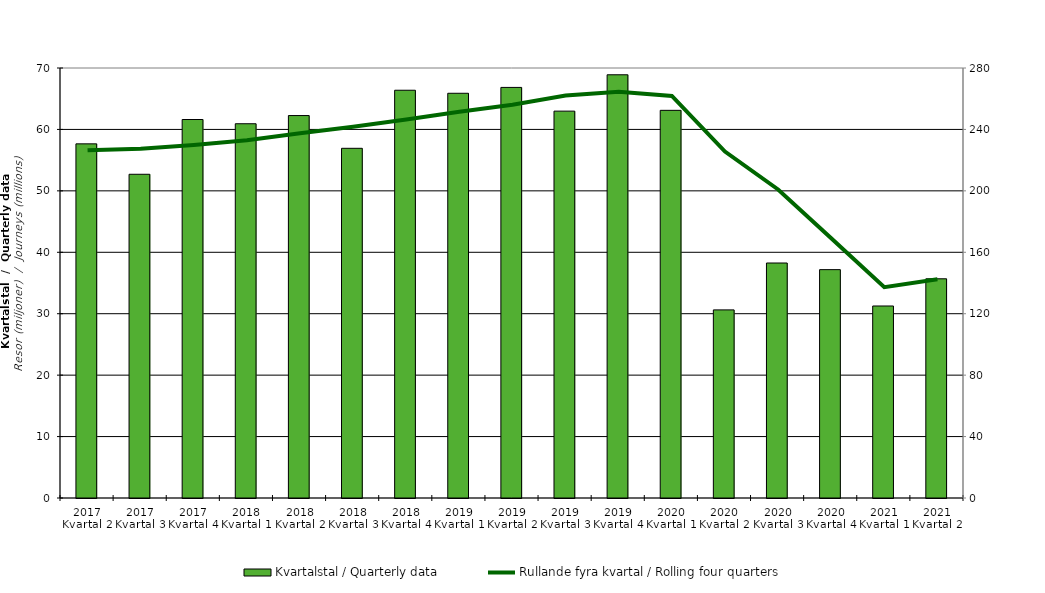
| Category | Kvartalstal / Quarterly data |
|---|---|
| 2017 Kvartal 2 | 57.652 |
| 2017 Kvartal 3 | 52.7 |
| 2017 Kvartal 4 | 61.615 |
| 2018 Kvartal 1 | 60.926 |
| 2018 Kvartal 2 | 62.259 |
| 2018 Kvartal 3 | 56.927 |
| 2018 Kvartal 4 | 66.378 |
| 2019 Kvartal 1 | 65.885 |
| 2019 Kvartal 2 | 66.84 |
| 2019 Kvartal 3 | 62.979 |
| 2019 Kvartal 4 | 68.898 |
| 2020 Kvartal 1 | 63.109 |
| 2020 Kvartal 2 | 30.624 |
| 2020 Kvartal 3 | 38.255 |
| 2020 Kvartal 4 | 37.175 |
| 2021 Kvartal 1 | 31.258 |
| 2021 Kvartal 2 | 35.687 |